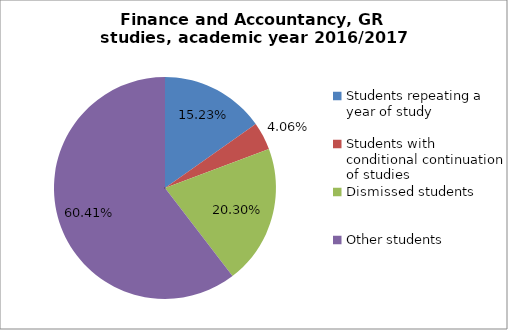
| Category | Series 0 |
|---|---|
| Students repeating a year of study | 30 |
| Students with conditional continuation of studies | 8 |
| Dismissed students | 40 |
| Other students | 119 |